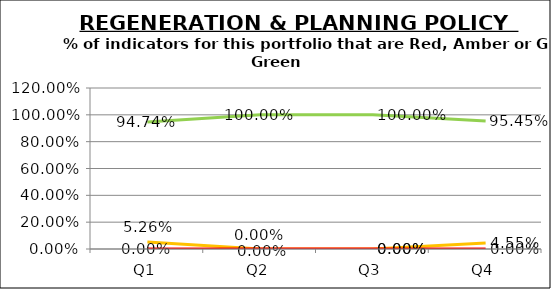
| Category | Green | Amber | Red |
|---|---|---|---|
| Q1 | 0.947 | 0.053 | 0 |
| Q2 | 1 | 0 | 0 |
| Q3 | 1 | 0 | 0 |
| Q4 | 0.955 | 0.045 | 0 |